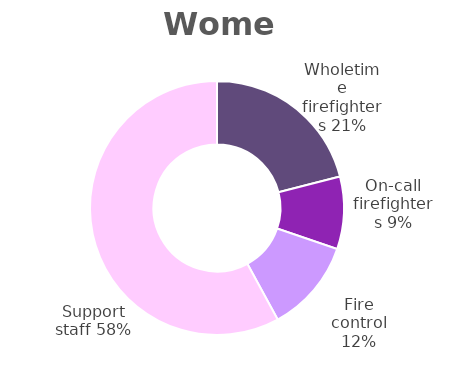
| Category | Women |
|---|---|
| Wholetime firefighters | 0.21 |
| On-call firefighters | 0.092 |
| Fire control | 0.118 |
| Support staff | 0.579 |